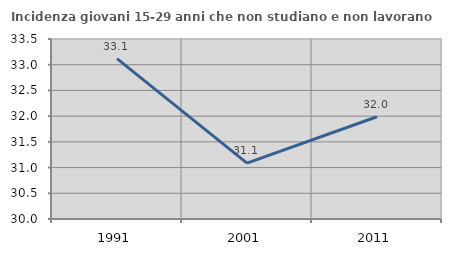
| Category | Incidenza giovani 15-29 anni che non studiano e non lavorano  |
|---|---|
| 1991.0 | 33.117 |
| 2001.0 | 31.086 |
| 2011.0 | 31.988 |